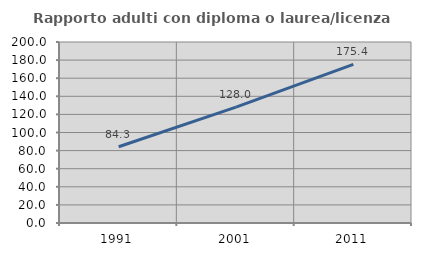
| Category | Rapporto adulti con diploma o laurea/licenza media  |
|---|---|
| 1991.0 | 84.29 |
| 2001.0 | 128.021 |
| 2011.0 | 175.369 |